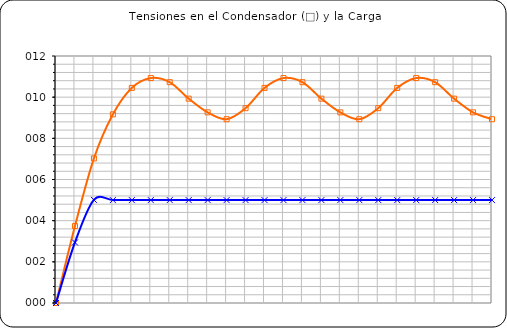
| Category | Series 0 | Series 1 |
|---|---|---|
| 0 | 0 | 0 |
| 1 | 3.738 | 2.941 |
| 2 | 7.024 | 5.01 |
| 3 | 9.165 | 5 |
| 4 | 10.45 | 5 |
| 5 | 10.928 | 5 |
| 6 | 10.728 | 5 |
| 7 | 9.928 | 5 |
| 8 | 9.261 | 5 |
| 9 | 8.928 | 5 |
| 10 | 9.464 | 5 |
| 11 | 10.45 | 5 |
| 12 | 10.928 | 5 |
| 13 | 10.728 | 5 |
| 14 | 9.928 | 5 |
| 15 | 9.261 | 5 |
| 16 | 8.928 | 5 |
| 17 | 9.464 | 5 |
| 18 | 10.45 | 5 |
| 19 | 10.928 | 5 |
| 20 | 10.728 | 5 |
| 21 | 9.928 | 5 |
| 22 | 9.261 | 5 |
| 23 | 8.928 | 5 |